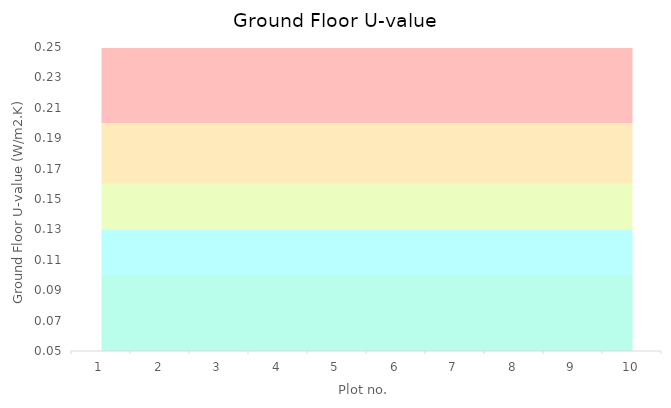
| Category | Series 0 | Series 1 | Series 2 | Series 3 | Series 4 |
|---|---|---|---|---|---|
| 0 | 0.1 | 0.03 | 0.03 | 0.04 | 0.05 |
| 1 | 0.1 | 0.03 | 0.03 | 0.04 | 0.05 |
| 2 | 0.1 | 0.03 | 0.03 | 0.04 | 0.05 |
| 3 | 0.1 | 0.03 | 0.03 | 0.04 | 0.05 |
| 4 | 0.1 | 0.03 | 0.03 | 0.04 | 0.05 |
| 5 | 0.1 | 0.03 | 0.03 | 0.04 | 0.05 |
| 6 | 0.1 | 0.03 | 0.03 | 0.04 | 0.05 |
| 7 | 0.1 | 0.03 | 0.03 | 0.04 | 0.05 |
| 8 | 0.1 | 0.03 | 0.03 | 0.04 | 0.05 |
| 9 | 0.1 | 0.03 | 0.03 | 0.04 | 0.05 |